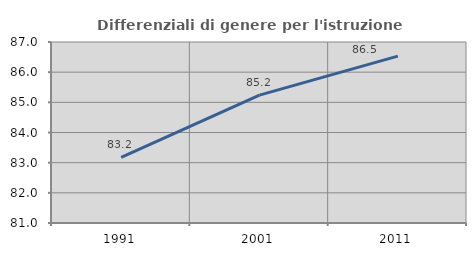
| Category | Differenziali di genere per l'istruzione superiore |
|---|---|
| 1991.0 | 83.177 |
| 2001.0 | 85.241 |
| 2011.0 | 86.532 |